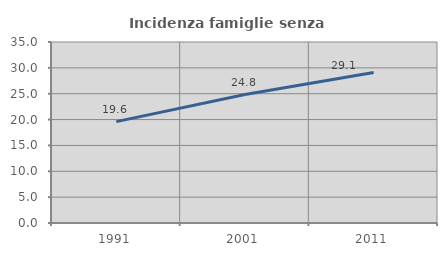
| Category | Incidenza famiglie senza nuclei |
|---|---|
| 1991.0 | 19.602 |
| 2001.0 | 24.846 |
| 2011.0 | 29.085 |